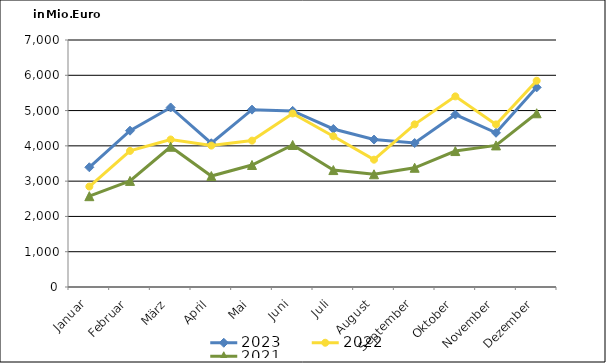
| Category | 2023 | 2022 | 2021 |
|---|---|---|---|
| Januar | 3392.866 | 2847.079 | 2573.967 |
| Februar | 4429.647 | 3857.191 | 3007.278 |
| März | 5088.028 | 4180.204 | 3974.693 |
| April | 4074.092 | 4007.883 | 3145.094 |
| Mai | 5026.22 | 4148.598 | 3458.148 |
| Juni | 4991.198 | 4917.763 | 4024.847 |
| Juli | 4477.872 | 4271.921 | 3313.896 |
| August | 4178.174 | 3608.813 | 3194.513 |
| September | 4079.518 | 4609.392 | 3379.007 |
| Oktober | 4886.134 | 5402.007 | 3852.571 |
| November | 4371.149 | 4607.724 | 4012.416 |
| Dezember | 5657.52 | 5844.792 | 4923.29 |